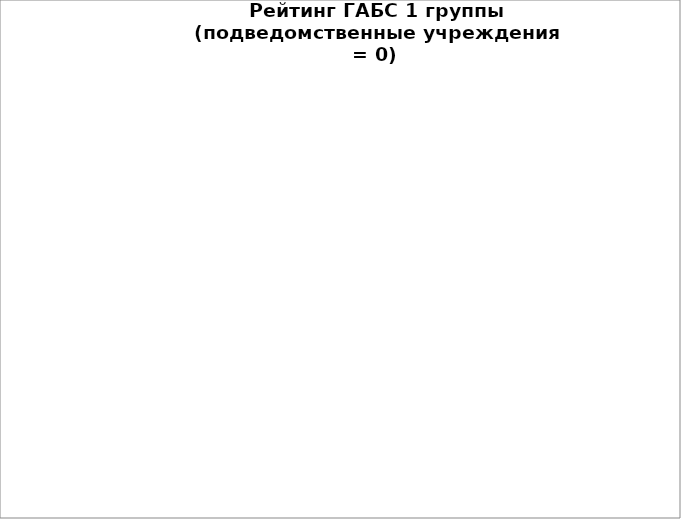
| Category | Series 0 |
|---|---|
| Департамент финансов Администрации города Омска | 100 |
| Департамент контрактной системы в сфере закупок Администрации города Омска | 100 |
| Контрольно-счетная палата города Омска | 99.919 |
| Омский городской Совет | 99.29 |
| Администрация Центрального административного округа города Омска | 99.233 |
| Администрация Октябрьского административного округа города Омска | 98.795 |
| Администрация Советского административного округа города Омска | 98.655 |
| Администрация Ленинского административного округа города Омска | 98.24 |
| Администрация Кировского административного округа города Омска | 97.552 |
| Департамент транспорта Администрации города Омска | 96.884 |
| Департамент строительства Администрации города Омска | 86.373 |